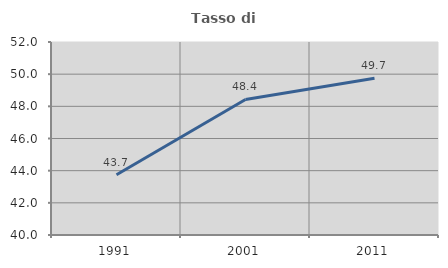
| Category | Tasso di occupazione   |
|---|---|
| 1991.0 | 43.744 |
| 2001.0 | 48.429 |
| 2011.0 | 49.749 |